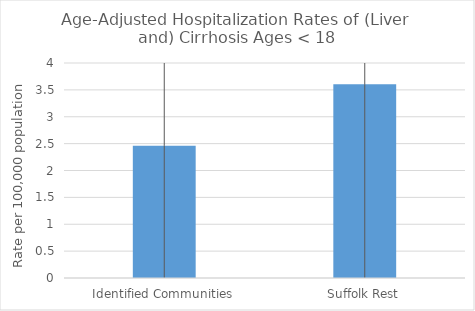
| Category | Age-Adjusted Hospitalization Rates of (Liver and) Cirrhosis Ages < 18 |
|---|---|
| Identified Communities | 2.459 |
| Suffolk Rest | 3.606 |